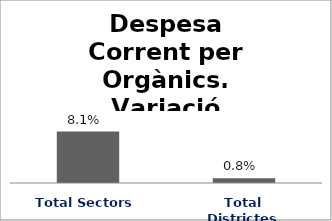
| Category | Series 0 |
|---|---|
| Total Sectors | 0.081 |
| Total Districtes | 0.008 |